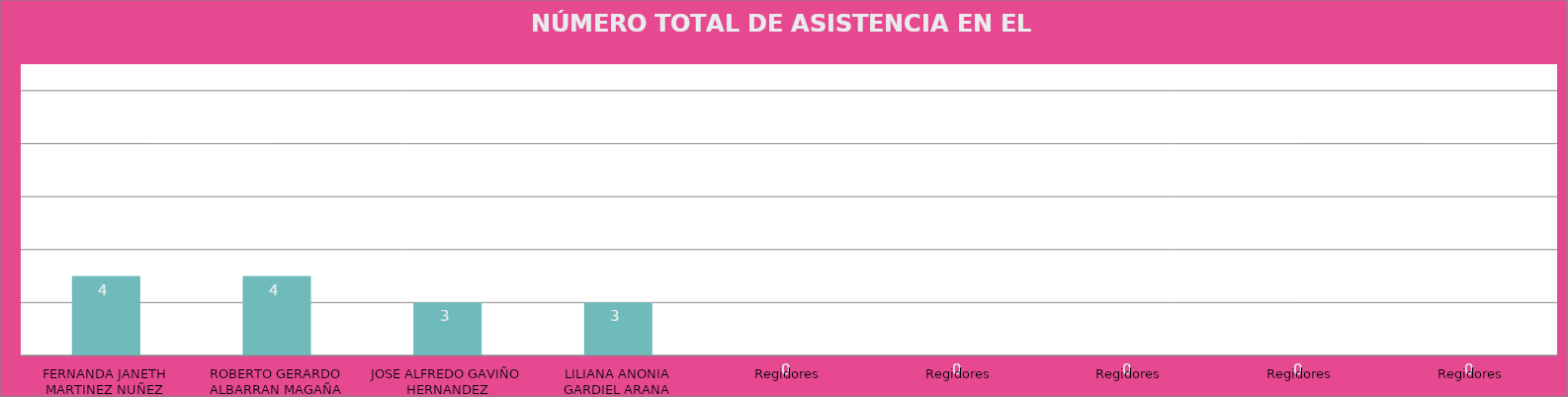
| Category | FERNANDA JANETH MARTINEZ NUÑEZ ROBERTO GERARDO ALBARRAN MAGAÑA JOSE ALFREDO GAVIÑO HERNANDEZ LILIANA ANONIA GARDIEL ARANA Regidores Regidores Regidores Regidores Regidores |
|---|---|
| FERNANDA JANETH MARTINEZ NUÑEZ | 4 |
| ROBERTO GERARDO ALBARRAN MAGAÑA | 4 |
| JOSE ALFREDO GAVIÑO HERNANDEZ | 3 |
| LILIANA ANONIA GARDIEL ARANA | 3 |
| Regidores | 0 |
| Regidores | 0 |
| Regidores | 0 |
| Regidores | 0 |
| Regidores | 0 |